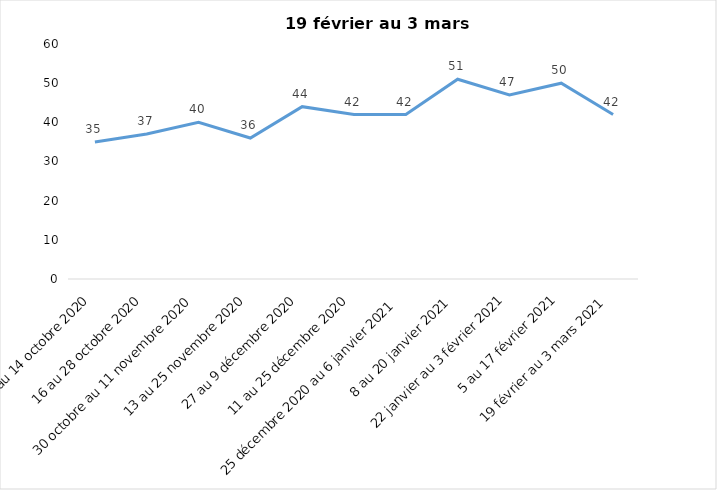
| Category | Toujours aux trois mesures |
|---|---|
| 2 au 14 octobre 2020 | 35 |
| 16 au 28 octobre 2020 | 37 |
| 30 octobre au 11 novembre 2020 | 40 |
| 13 au 25 novembre 2020 | 36 |
| 27 au 9 décembre 2020 | 44 |
| 11 au 25 décembre 2020 | 42 |
| 25 décembre 2020 au 6 janvier 2021 | 42 |
| 8 au 20 janvier 2021 | 51 |
| 22 janvier au 3 février 2021 | 47 |
| 5 au 17 février 2021 | 50 |
| 19 février au 3 mars 2021 | 42 |